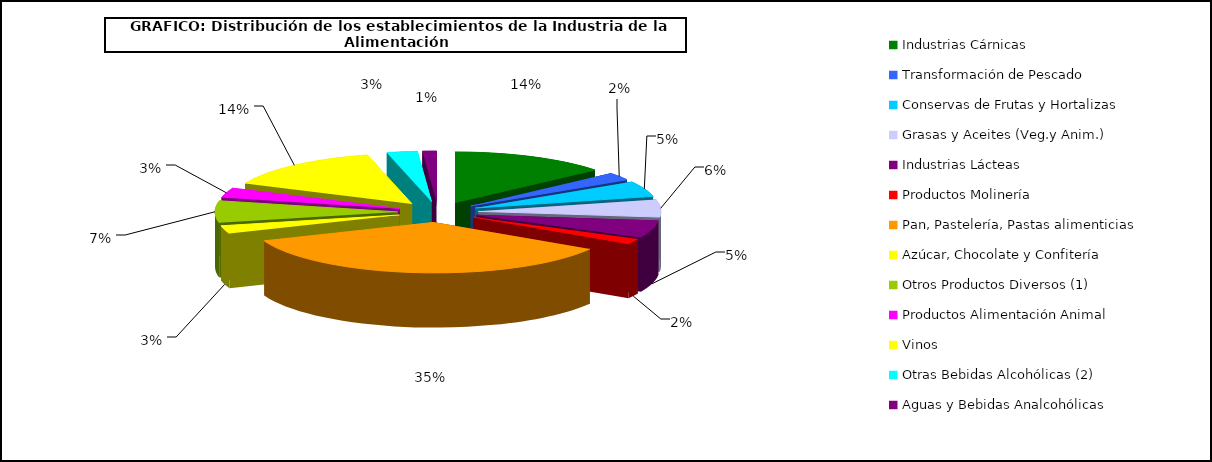
| Category | Series 0 |
|---|---|
| Industrias Cárnicas | 4604 |
| Transformación de Pescado | 811 |
| Conservas de Frutas y Hortalizas   | 1648 |
| Grasas y Aceites (Veg.y Anim.) | 1837 |
| Industrias Lácteas | 1792 |
| Productos Molinería | 541 |
| Pan, Pastelería, Pastas alimenticias | 11681 |
| Azúcar, Chocolate y Confitería | 842 |
| Otros Productos Diversos (1) | 2311 |
| Productos Alimentación Animal | 1037 |
| Vinos | 4783 |
| Otras Bebidas Alcohólicas (2) | 896 |
| Aguas y Bebidas Analcohólicas  | 410 |